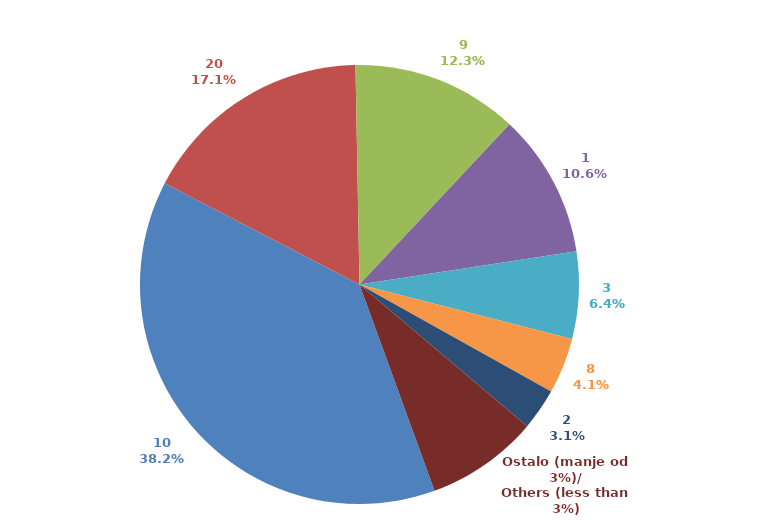
| Category | Series 0 |
|---|---|
| 10 | 0.382 |
| 20 | 0.171 |
| 9 | 0.123 |
| 1 | 0.106 |
| 3 | 0.064 |
| 8 | 0.041 |
| 2 | 0.031 |
| Ostalo (manje od 3%)/
Others (less than 3%) | 0.083 |